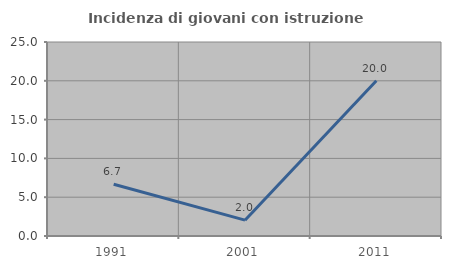
| Category | Incidenza di giovani con istruzione universitaria |
|---|---|
| 1991.0 | 6.667 |
| 2001.0 | 2.041 |
| 2011.0 | 20 |